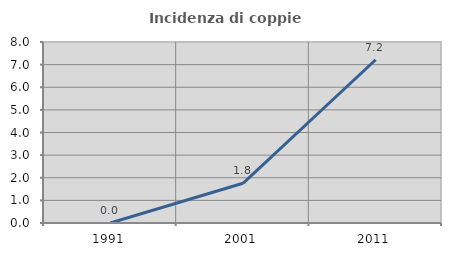
| Category | Incidenza di coppie miste |
|---|---|
| 1991.0 | 0 |
| 2001.0 | 1.754 |
| 2011.0 | 7.216 |